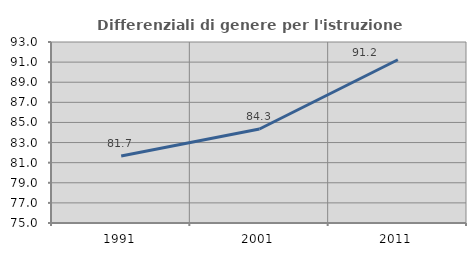
| Category | Differenziali di genere per l'istruzione superiore |
|---|---|
| 1991.0 | 81.669 |
| 2001.0 | 84.347 |
| 2011.0 | 91.236 |